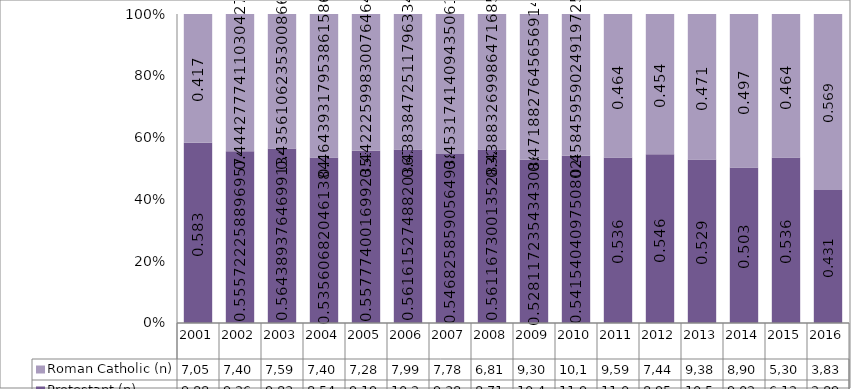
| Category | Protestant (n) | Roman Catholic (n) |
|---|---|---|
| 2001.0 | 9884 | 7057 |
| 2002.0 | 9260 | 7403 |
| 2003.0 | 9839 | 7594 |
| 2004.0 | 8544 | 7408 |
| 2005.0 | 9191 | 7287 |
| 2006.0 | 10236 | 7990 |
| 2007.0 | 9389 | 7781 |
| 2008.0 | 8711 | 6812 |
| 2009.0 | 10415 | 9306 |
| 2010.0 | 11974 | 10137 |
| 2011.0 | 11067 | 9590 |
| 2012.0 | 8956 | 7443 |
| 2013.0 | 10556 | 9380 |
| 2014.0 | 9025 | 8909 |
| 2015.0 | 6121 | 5305 |
| 2016.0 | 2898 | 3830 |